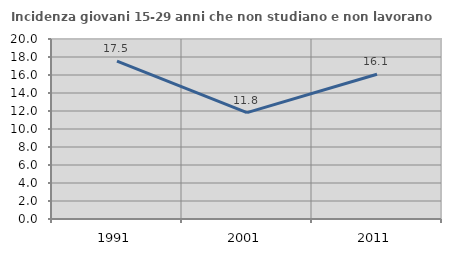
| Category | Incidenza giovani 15-29 anni che non studiano e non lavorano  |
|---|---|
| 1991.0 | 17.537 |
| 2001.0 | 11.818 |
| 2011.0 | 16.082 |